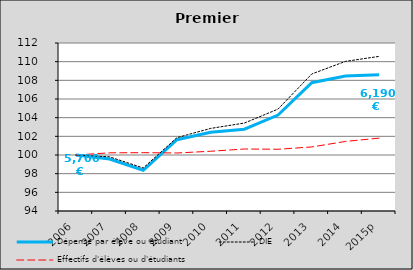
| Category | Dépense par élève ou étudiant  | DIE | Effectifs d'élèves ou d'étudiants |
|---|---|---|---|
| 2006 | 100 | 100 | 100 |
| 2007 | 99.571 | 99.803 | 100.233 |
| 2008 | 98.362 | 98.607 | 100.25 |
| 2009 | 101.64 | 101.859 | 100.215 |
| 2010 | 102.436 | 102.848 | 100.402 |
| 2011 | 102.762 | 103.422 | 100.642 |
| 2012 | 104.277 | 104.919 | 100.615 |
| 2013 | 107.749 | 108.679 | 100.864 |
| 2014 | 108.456 | 110.03 | 101.451 |
| 2015p | 108.602 | 110.567 | 101.809 |